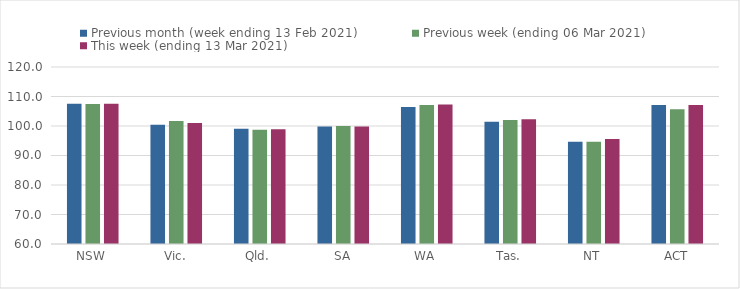
| Category | Previous month (week ending 13 Feb 2021) | Previous week (ending 06 Mar 2021) | This week (ending 13 Mar 2021) |
|---|---|---|---|
| NSW | 107.56 | 107.49 | 107.54 |
| Vic. | 100.42 | 101.73 | 100.98 |
| Qld. | 99.08 | 98.74 | 98.92 |
| SA | 99.84 | 100 | 99.85 |
| WA | 106.48 | 107.08 | 107.25 |
| Tas. | 101.42 | 102.02 | 102.33 |
| NT | 94.65 | 94.65 | 95.59 |
| ACT | 107.09 | 105.67 | 107.09 |